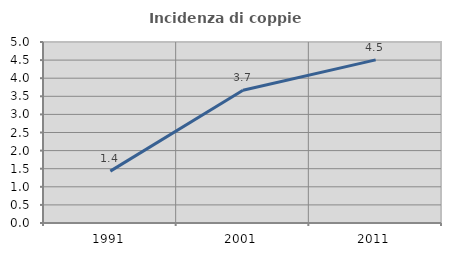
| Category | Incidenza di coppie miste |
|---|---|
| 1991.0 | 1.433 |
| 2001.0 | 3.665 |
| 2011.0 | 4.507 |